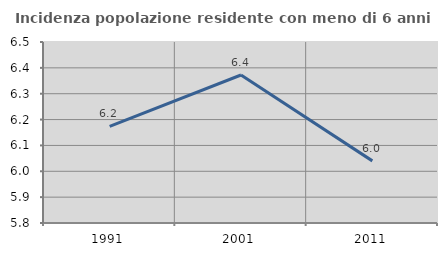
| Category | Incidenza popolazione residente con meno di 6 anni |
|---|---|
| 1991.0 | 6.173 |
| 2001.0 | 6.372 |
| 2011.0 | 6.04 |